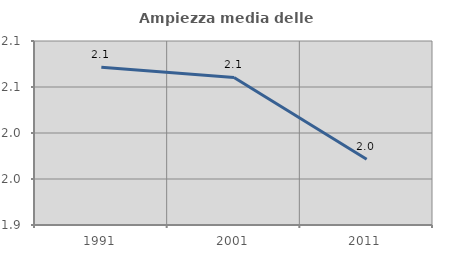
| Category | Ampiezza media delle famiglie |
|---|---|
| 1991.0 | 2.071 |
| 2001.0 | 2.06 |
| 2011.0 | 1.971 |